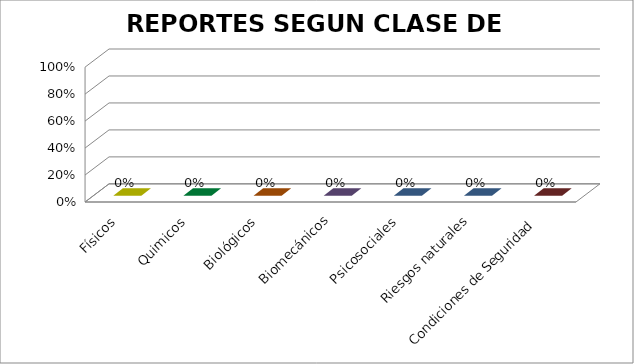
| Category | Series 0 |
|---|---|
| Físicos | 0 |
| Quimicos | 0 |
| Biológicos | 0 |
| Biomecánicos | 0 |
| Psicosociales | 0 |
| Riesgos naturales | 0 |
| Condiciones de Seguridad | 0 |